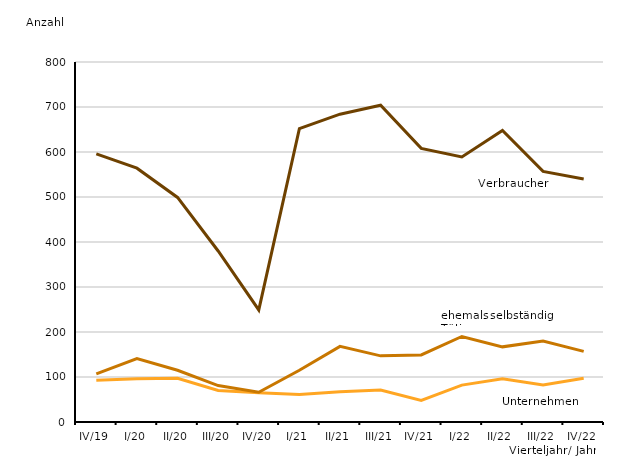
| Category | Unternehmen | Verbraucher | ehemals selbständig Tätige |
|---|---|---|---|
| IV/19 | 93 | 596 | 107 |
| I/20 | 96 | 564 | 141 |
| II/20 | 97 | 499 | 115 |
| III/20 | 70 | 380 | 81 |
| IV/20 | 65 | 249 | 66 |
| I/21 | 61 | 652 | 115 |
| II/21 | 67 | 684 | 168 |
| III/21 | 71 | 704 | 147 |
| IV/21 | 48 | 608 | 149 |
| I/22 | 82 | 589 | 190 |
| II/22 | 96 | 648 | 167 |
| III/22 | 82 | 557 | 180 |
| IV/22 | 97 | 540 | 157 |